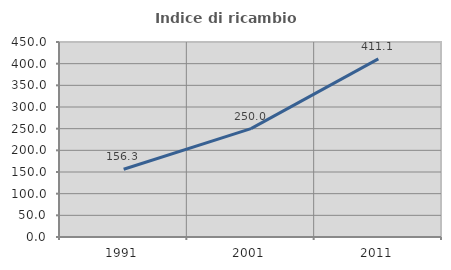
| Category | Indice di ricambio occupazionale  |
|---|---|
| 1991.0 | 156.25 |
| 2001.0 | 250 |
| 2011.0 | 411.111 |